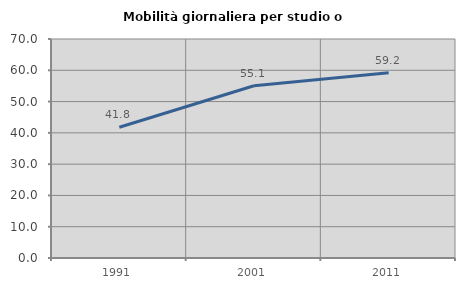
| Category | Mobilità giornaliera per studio o lavoro |
|---|---|
| 1991.0 | 41.776 |
| 2001.0 | 55.066 |
| 2011.0 | 59.195 |